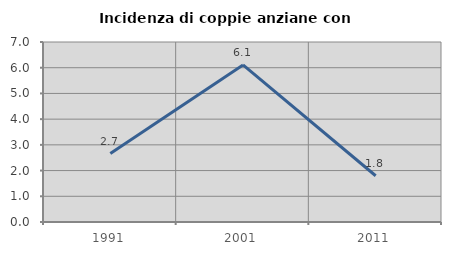
| Category | Incidenza di coppie anziane con figli |
|---|---|
| 1991.0 | 2.663 |
| 2001.0 | 6.109 |
| 2011.0 | 1.799 |